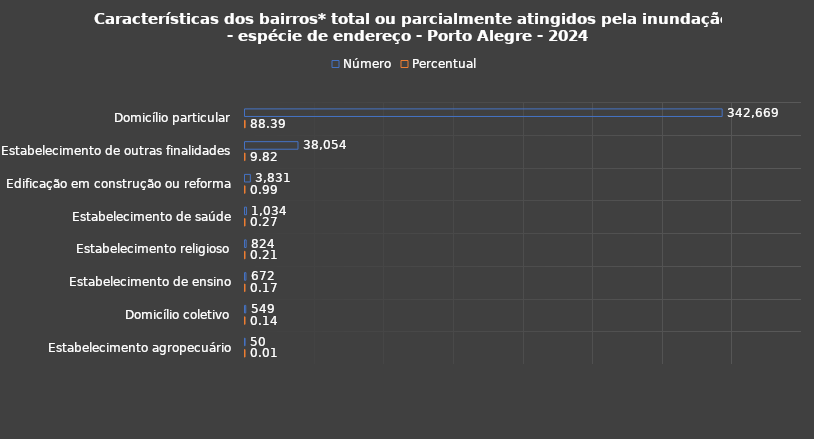
| Category | Número | Percentual |
|---|---|---|
| Domicílio particular | 342669 | 88.389 |
| Estabelecimento de outras finalidades | 38054 | 9.816 |
| Edificação em construção ou reforma | 3831 | 0.988 |
| Estabelecimento de saúde | 1034 | 0.267 |
| Estabelecimento religioso | 824 | 0.213 |
| Estabelecimento de ensino | 672 | 0.173 |
| Domicílio coletivo | 549 | 0.142 |
| Estabelecimento agropecuário | 50 | 0.013 |